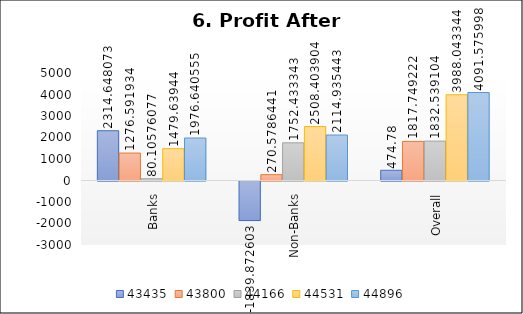
| Category | 43435 | 43800 | 44166 | 44531 | 44896 |
|---|---|---|---|---|---|
| Banks | 2314.648 | 1276.592 | 80.106 | 1479.639 | 1976.641 |
| Non-Banks | -1839.873 | 270.579 | 1752.433 | 2508.404 | 2114.935 |
| Overall | 474.78 | 1817.749 | 1832.539 | 3988.043 | 4091.576 |